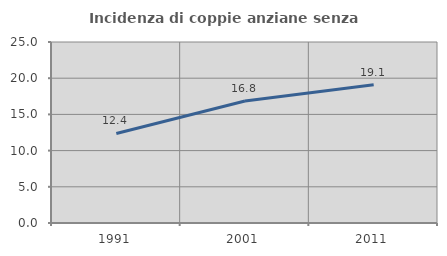
| Category | Incidenza di coppie anziane senza figli  |
|---|---|
| 1991.0 | 12.371 |
| 2001.0 | 16.842 |
| 2011.0 | 19.101 |